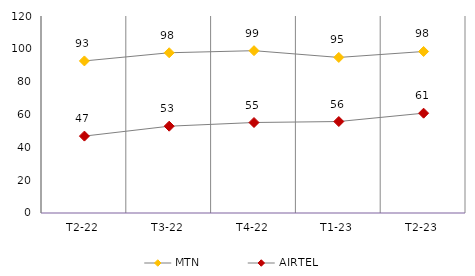
| Category | MTN | AIRTEL | WARID |
|---|---|---|---|
| T2-22 | 92.628 | 46.842 |  |
| T3-22 | 97.612 | 52.88 |  |
| T4-22 | 98.872 | 55.124 |  |
| T1-23 | 94.754 | 55.723 |  |
| T2-23 | 98.381 | 60.803 |  |